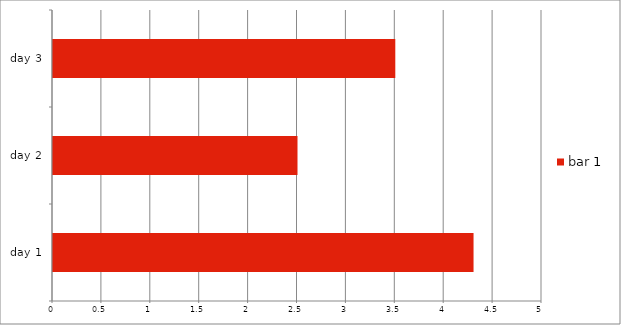
| Category | bar 1 |
|---|---|
| day 1 | 4.3 |
| day 2 | 2.5 |
| day 3 | 3.5 |